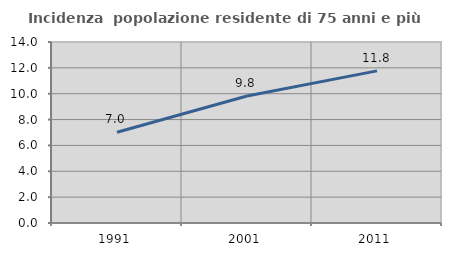
| Category | Incidenza  popolazione residente di 75 anni e più |
|---|---|
| 1991.0 | 7.018 |
| 2001.0 | 9.825 |
| 2011.0 | 11.765 |